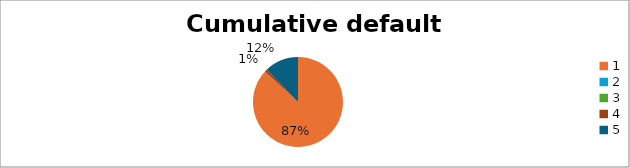
| Category | Series 0 |
|---|---|
| 0 | 0.869 |
| 1 | 0 |
| 2 | 0 |
| 3 | 0.009 |
| 4 | 0.123 |